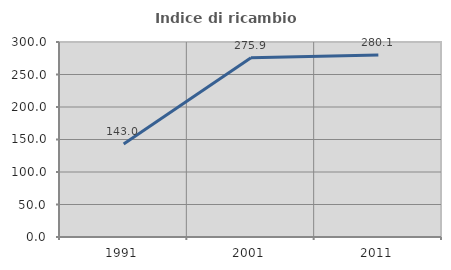
| Category | Indice di ricambio occupazionale  |
|---|---|
| 1991.0 | 143.005 |
| 2001.0 | 275.862 |
| 2011.0 | 280.147 |